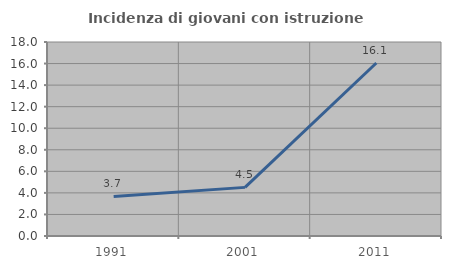
| Category | Incidenza di giovani con istruzione universitaria |
|---|---|
| 1991.0 | 3.675 |
| 2001.0 | 4.511 |
| 2011.0 | 16.052 |